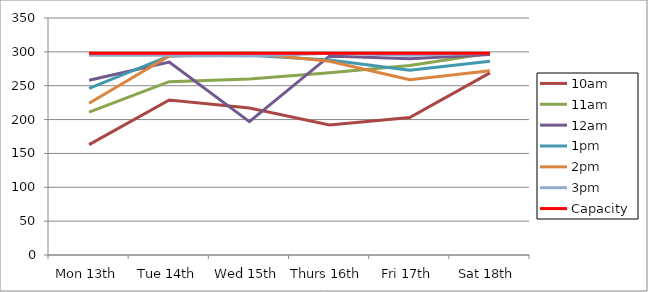
| Category | 9am | 10am | 11am | 12am | 1pm | 2pm | 3pm | 4pm | 5pm | Capacity |
|---|---|---|---|---|---|---|---|---|---|---|
| Mon 13th |  | 163 | 211 | 258 | 246 | 224 | 295 |  |  | 298 |
| Tue 14th |  | 229 | 256 | 285 | 294 | 294 | 295 |  |  | 298 |
| Wed 15th |  | 217 | 260 | 197 | 295 | 298 | 294 |  |  | 298 |
| Thurs 16th |  | 192 | 269 | 294 | 288 | 286 | 298 |  |  | 298 |
| Fri 17th |  | 203 | 280 | 290 | 273 | 259 | 295 |  |  | 298 |
| Sat 18th |  | 269 | 298 | 296 | 286 | 272 | 298 |  |  | 298 |